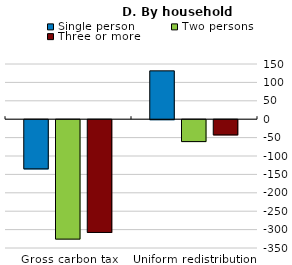
| Category | Single person | Two persons | Three or more |
|---|---|---|---|
| Gross carbon tax | -133.661 | -324.514 | -306.377 |
| Uniform redistribution | 131.382 | -59.471 | -41.334 |